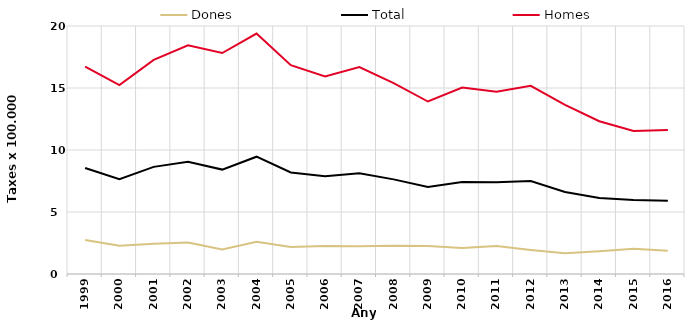
| Category | Dones | Total | Homes |
|---|---|---|---|
| 1999.0 | 2.75 | 8.55 | 16.72 |
| 2000.0 | 2.27 | 7.64 | 15.23 |
| 2001.0 | 2.43 | 8.64 | 17.27 |
| 2002.0 | 2.54 | 9.05 | 18.44 |
| 2003.0 | 1.97 | 8.42 | 17.82 |
| 2004.0 | 2.59 | 9.46 | 19.39 |
| 2005.0 | 2.18 | 8.19 | 16.84 |
| 2006.0 | 2.25 | 7.89 | 15.93 |
| 2007.0 | 2.23 | 8.12 | 16.69 |
| 2008.0 | 2.28 | 7.63 | 15.4 |
| 2009.0 | 2.25 | 7.02 | 13.91 |
| 2010.0 | 2.09 | 7.42 | 15.04 |
| 2011.0 | 2.25 | 7.4 | 14.7 |
| 2012.0 | 1.94 | 7.49 | 15.18 |
| 2013.0 | 1.68 | 6.62 | 13.64 |
| 2014.0 | 1.84 | 6.13 | 12.32 |
| 2015.0 | 2.04 | 5.97 | 11.53 |
| 2016.0 | 1.88 | 5.91 | 11.61 |